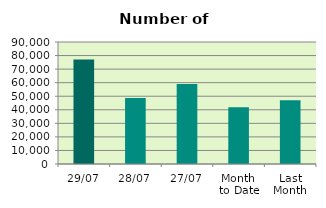
| Category | Series 0 |
|---|---|
| 29/07 | 77014 |
| 28/07 | 48652 |
| 27/07 | 59072 |
| Month 
to Date | 41833.429 |
| Last
Month | 46980.273 |